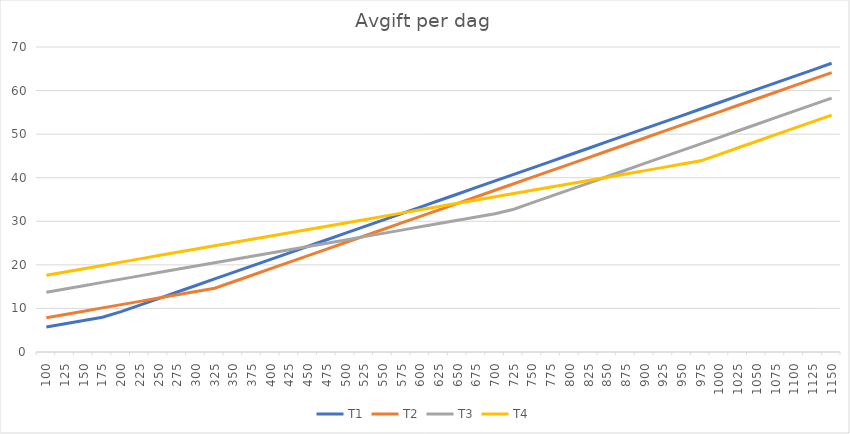
| Category | T1 | T2 | T3 | T4 |
|---|---|---|---|---|
| 100.0 | 5.729 | 7.874 | 13.726 | 17.625 |
| 125.0 | 6.479 | 8.624 | 14.476 | 18.375 |
| 150.0 | 7.229 | 9.374 | 15.226 | 19.125 |
| 175.0 | 7.979 | 10.124 | 15.976 | 19.875 |
| 200.0 | 9.269 | 10.874 | 16.726 | 20.625 |
| 225.0 | 10.769 | 11.624 | 17.476 | 21.375 |
| 250.0 | 12.269 | 12.374 | 18.226 | 22.125 |
| 275.0 | 13.769 | 13.124 | 18.976 | 22.875 |
| 300.0 | 15.269 | 13.874 | 19.726 | 23.625 |
| 325.0 | 16.769 | 14.624 | 20.476 | 24.375 |
| 350.0 | 18.269 | 16.124 | 21.226 | 25.125 |
| 375.0 | 19.769 | 17.624 | 21.976 | 25.875 |
| 400.0 | 21.269 | 19.124 | 22.726 | 26.625 |
| 425.0 | 22.769 | 20.624 | 23.476 | 27.375 |
| 450.0 | 24.269 | 22.124 | 24.226 | 28.125 |
| 475.0 | 25.769 | 23.624 | 24.976 | 28.875 |
| 500.0 | 27.269 | 25.124 | 25.726 | 29.625 |
| 525.0 | 28.769 | 26.624 | 26.476 | 30.375 |
| 550.0 | 30.269 | 28.124 | 27.226 | 31.125 |
| 575.0 | 31.769 | 29.624 | 27.976 | 31.875 |
| 600.0 | 33.269 | 31.124 | 28.726 | 32.625 |
| 625.0 | 34.769 | 32.624 | 29.476 | 33.375 |
| 650.0 | 36.269 | 34.124 | 30.226 | 34.125 |
| 675.0 | 37.769 | 35.624 | 30.976 | 34.875 |
| 700.0 | 39.269 | 37.124 | 31.726 | 35.625 |
| 725.0 | 40.769 | 38.624 | 32.776 | 36.375 |
| 750.0 | 42.269 | 40.124 | 34.276 | 37.125 |
| 775.0 | 43.769 | 41.624 | 35.776 | 37.875 |
| 800.0 | 45.269 | 43.124 | 37.276 | 38.625 |
| 825.0 | 46.769 | 44.624 | 38.776 | 39.375 |
| 850.0 | 48.269 | 46.124 | 40.276 | 40.125 |
| 875.0 | 49.769 | 47.624 | 41.776 | 40.875 |
| 900.0 | 51.269 | 49.124 | 43.276 | 41.625 |
| 925.0 | 52.769 | 50.624 | 44.776 | 42.375 |
| 950.0 | 54.269 | 52.124 | 46.276 | 43.125 |
| 975.0 | 55.769 | 53.624 | 47.776 | 43.875 |
| 1000.0 | 57.269 | 55.124 | 49.276 | 45.375 |
| 1025.0 | 58.769 | 56.624 | 50.776 | 46.875 |
| 1050.0 | 60.269 | 58.124 | 52.276 | 48.375 |
| 1075.0 | 61.769 | 59.624 | 53.776 | 49.875 |
| 1100.0 | 63.269 | 61.124 | 55.276 | 51.375 |
| 1125.0 | 64.769 | 62.624 | 56.776 | 52.875 |
| 1150.0 | 66.269 | 64.124 | 58.276 | 54.375 |